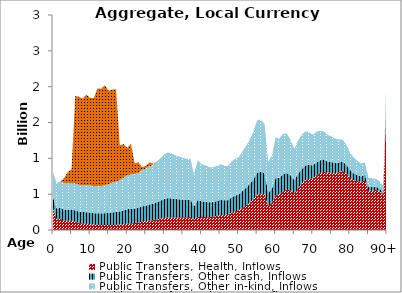
| Category | Public Transfers, Health, Inflows | Public Transfers, Other cash, Inflows | Public Transfers, Other in-kind, Inflows | Public Transfers, Education, Inflows |
|---|---|---|---|---|
| 0 | 306.347 | 148.822 | 352.346 | 0 |
|  | 149.455 | 149.587 | 354.157 | 0 |
| 2 | 156.934 | 154.329 | 365.385 | 0 |
| 3 | 129.705 | 155.662 | 368.54 | 71.273 |
| 4 | 128.46 | 155.284 | 367.646 | 159.231 |
| 5 | 129.099 | 155.587 | 368.362 | 195.037 |
| 6 | 115.371 | 158.938 | 376.295 | 1219.333 |
| 7 | 98.466 | 158.161 | 374.457 | 1227.347 |
| 8 | 92.591 | 157.678 | 373.314 | 1209.773 |
| 9 | 88.492 | 160.295 | 379.509 | 1261.048 |
| 10 | 83.105 | 160.797 | 380.697 | 1219.435 |
| 11 | 76.312 | 158.452 | 375.146 | 1232.101 |
| 12 | 71.969 | 161.267 | 381.81 | 1360.608 |
| 13 | 70.346 | 161.208 | 381.672 | 1357.793 |
| 14 | 70.435 | 165.142 | 390.986 | 1392.477 |
| 15 | 70.185 | 168.426 | 398.759 | 1305.859 |
| 16 | 71.217 | 175.053 | 414.451 | 1299.754 |
| 17 | 71.487 | 180.09 | 426.375 | 1285.333 |
| 18 | 76.071 | 184.171 | 436.036 | 485.414 |
| 19 | 82.591 | 192.511 | 455.783 | 467.675 |
| 20 | 89.34 | 200.69 | 475.148 | 379.549 |
| 21 | 93.829 | 203.436 | 481.649 | 427.792 |
| 22 | 96.988 | 203.332 | 481.403 | 147.307 |
| 23 | 103.311 | 205.645 | 486.878 | 148.861 |
| 24 | 113.663 | 215.471 | 510.142 | 37.408 |
| 25 | 120.993 | 218.863 | 518.174 | 37.104 |
| 26 | 130.323 | 225.471 | 533.818 | 54.11 |
| 27 | 138.566 | 229.623 | 543.647 | 13.147 |
| 28 | 148.188 | 240.577 | 569.583 | 0 |
| 29 | 157.852 | 251.215 | 594.767 | 0 |
| 30 | 169.379 | 264.238 | 625.601 | 0 |
| 31 | 175.962 | 269.221 | 637.398 | 0 |
| 32 | 175.979 | 264.356 | 625.88 | 0 |
| 33 | 176.131 | 257.997 | 610.825 | 0 |
| 34 | 176.017 | 251.561 | 595.589 | 0 |
| 35 | 176.738 | 246.633 | 583.921 | 0 |
| 36 | 177.59 | 241.811 | 572.505 | 0 |
| 37 | 181.607 | 241.931 | 572.787 | 0 |
| 38 | 144.521 | 188.461 | 446.194 | 0 |
| 39 | 183.449 | 234.428 | 555.023 | 0 |
| 40 | 181.396 | 219.253 | 519.096 | 0 |
| 41 | 180.901 | 214.547 | 507.954 | 0 |
| 42 | 178.479 | 207.696 | 491.735 | 0 |
| 43 | 184.434 | 204.72 | 484.689 | 0 |
| 44 | 194.692 | 206.815 | 489.647 | 0 |
| 45 | 207.287 | 210.979 | 499.507 | 0 |
| 46 | 210.258 | 205.547 | 486.647 | 0 |
| 47 | 213.032 | 200.281 | 474.178 | 0 |
| 48 | 238.094 | 210.802 | 499.089 | 0 |
| 49 | 260.695 | 218.15 | 516.486 | 0 |
| 50 | 275.341 | 218.348 | 516.953 | 0 |
| 51 | 308.712 | 232.659 | 550.835 | 0 |
| 52 | 342.475 | 245.614 | 581.509 | 0 |
| 53 | 380.846 | 260.718 | 617.267 | 0 |
| 54 | 428.815 | 280.932 | 665.125 | 0 |
| 55 | 491.042 | 307.988 | 729.183 | 0 |
| 56 | 510.203 | 306.09 | 724.689 | 0 |
| 57 | 501.588 | 291.051 | 689.083 | 0 |
| 58 | 336.505 | 182.44 | 431.939 | 0 |
| 59 | 381.199 | 196.002 | 464.047 | 0 |
| 60 | 486.992 | 238.747 | 565.249 | 0 |
| 61 | 497.179 | 231.772 | 548.737 | 0 |
| 62 | 540.255 | 238.367 | 564.349 | 0 |
| 63 | 563.853 | 231.637 | 548.416 | 0 |
| 64 | 552.723 | 211.484 | 500.702 | 0 |
| 65 | 512.745 | 184.146 | 435.977 | 0 |
| 66 | 581.882 | 196.74 | 465.795 | 0 |
| 67 | 645.729 | 202.725 | 479.964 | 0 |
| 68 | 698.418 | 201.695 | 477.526 | 0 |
| 69 | 716.342 | 192.493 | 455.74 | 0 |
| 70 | 720.231 | 181.121 | 428.816 | 0 |
| 71 | 763.186 | 180.372 | 427.043 | 0 |
| 72 | 799.334 | 174.461 | 413.049 | 0 |
| 73 | 811.344 | 167.441 | 396.427 | 0 |
| 74 | 797.966 | 157.466 | 372.812 | 0 |
| 75 | 798.192 | 150.921 | 357.315 | 0 |
| 76 | 791.723 | 143.679 | 340.169 | 0 |
| 77 | 806.711 | 135.922 | 321.806 | 0 |
| 78 | 826.881 | 129.839 | 307.402 | 0 |
| 79 | 796.676 | 118.481 | 280.511 | 0 |
| 80 | 735.146 | 103.774 | 245.692 | 0 |
| 81 | 696.837 | 93.743 | 221.944 | 0 |
| 82 | 684.544 | 84.268 | 199.51 | 0 |
| 83 | 671.449 | 75.464 | 178.667 | 0 |
| 84 | 697.639 | 73.43 | 173.85 | 0 |
| 85 | 549.956 | 54.412 | 128.824 | 0 |
| 86 | 546.92 | 51.073 | 120.92 | 0 |
| 87 | 559.572 | 46.188 | 109.354 | 0 |
| 88 | 538.789 | 41.529 | 98.323 | 0 |
| 89 | 492.474 | 35.603 | 84.292 | 0 |
| 90+ | 1987.415 | 135.279 | 320.283 | 0 |